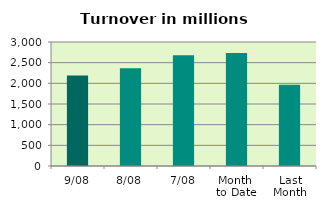
| Category | Series 0 |
|---|---|
| 9/08 | 2189.415 |
| 8/08 | 2363.065 |
| 7/08 | 2677.824 |
| Month 
to Date | 2733.874 |
| Last
Month | 1965.856 |